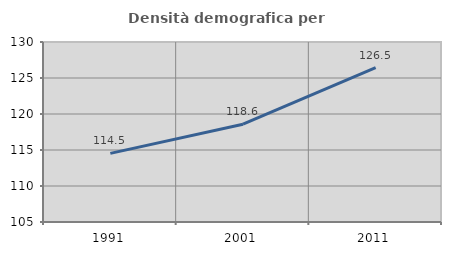
| Category | Densità demografica |
|---|---|
| 1991.0 | 114.531 |
| 2001.0 | 118.578 |
| 2011.0 | 126.456 |